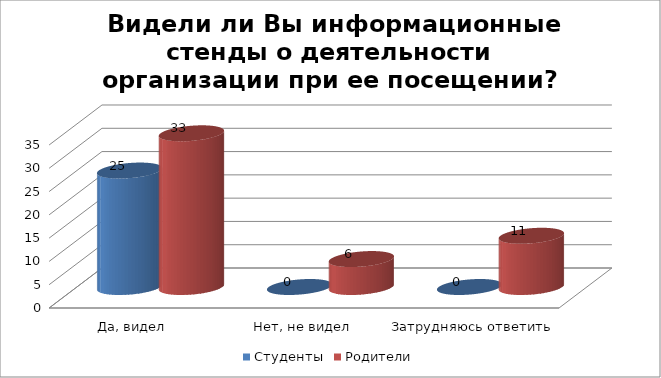
| Category | Студенты | Родители |
|---|---|---|
| Да, видел | 25 | 33 |
| Нет, не видел | 0 | 6 |
| Затрудняюсь ответить | 0 | 11 |